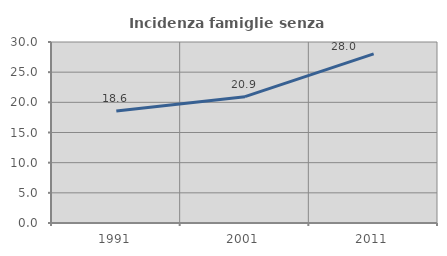
| Category | Incidenza famiglie senza nuclei |
|---|---|
| 1991.0 | 18.561 |
| 2001.0 | 20.934 |
| 2011.0 | 28.03 |